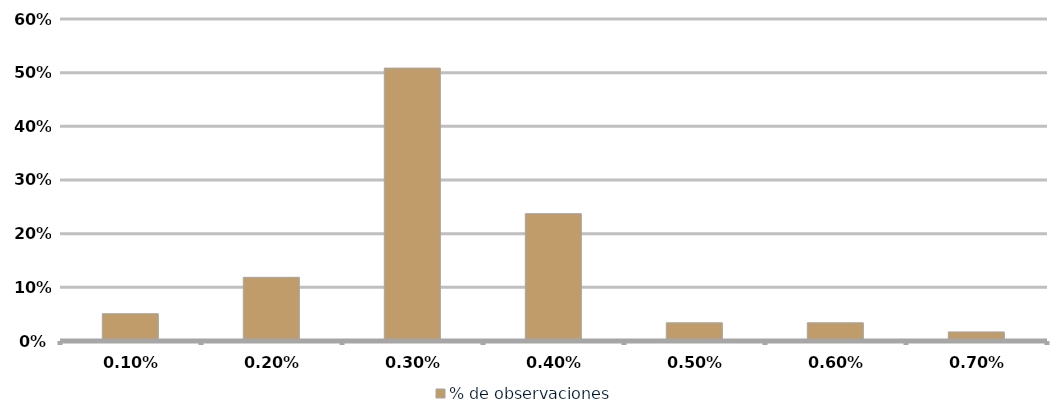
| Category | % de observaciones  |
|---|---|
| 0.001 | 0.051 |
| 0.002 | 0.119 |
| 0.003 | 0.508 |
| 0.004 | 0.237 |
| 0.005 | 0.034 |
| 0.006 | 0.034 |
| 0.007 | 0.017 |